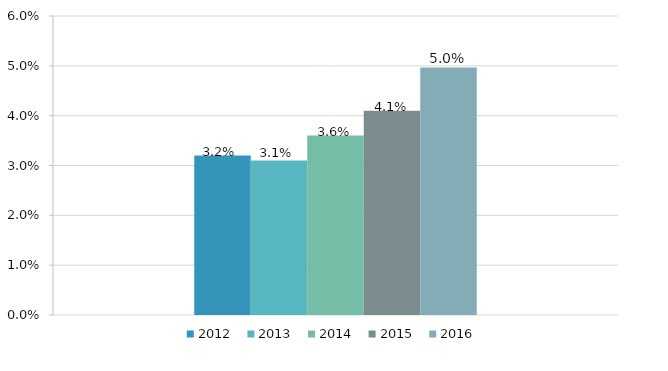
| Category | 2012 | 2013 | 2014 | 2015 | 2016 |
|---|---|---|---|---|---|
| Série | 0.032 | 0.031 | 0.036 | 0.041 | 0.05 |